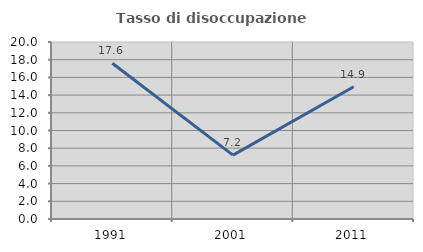
| Category | Tasso di disoccupazione giovanile  |
|---|---|
| 1991.0 | 17.593 |
| 2001.0 | 7.216 |
| 2011.0 | 14.943 |